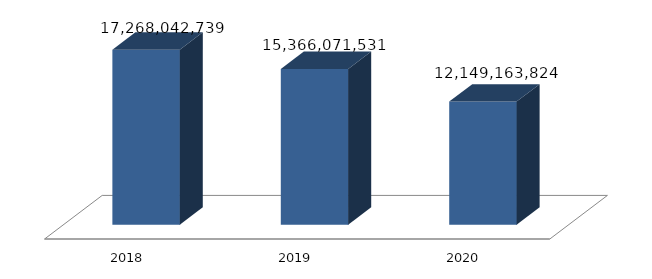
| Category | Peningkatan Sarana dan Prasarana Aparatur Kementerian Pertahanan |
|---|---|
| 2018.0 | 17268042739 |
| 2019.0 | 15366071531 |
| 2020.0 | 12149163824 |